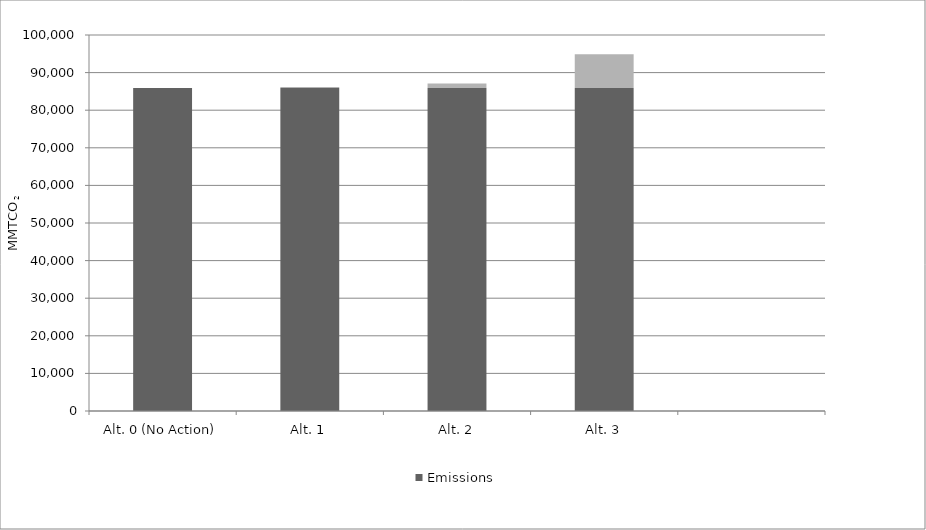
| Category | Emissions | Emissions Difference Compared to No Action Alternative |
|---|---|---|
| Alt. 0 (No Action) | 85900 | 0 |
| Alt. 1 | 85900 | 300 |
| Alt. 2 | 85900 | 1200 |
| Alt. 3 | 85900 | 9000 |